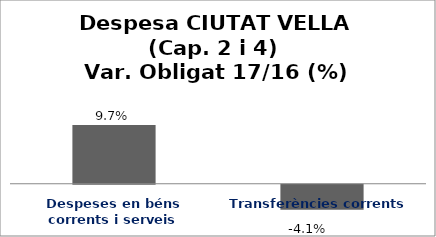
| Category | Series 0 |
|---|---|
| Despeses en béns corrents i serveis | 0.097 |
| Transferències corrents | -0.041 |